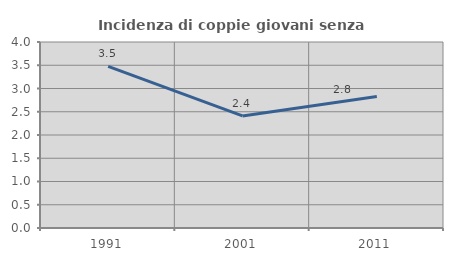
| Category | Incidenza di coppie giovani senza figli |
|---|---|
| 1991.0 | 3.476 |
| 2001.0 | 2.411 |
| 2011.0 | 2.827 |